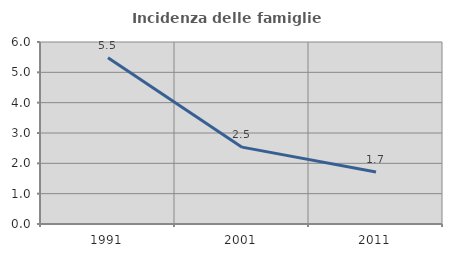
| Category | Incidenza delle famiglie numerose |
|---|---|
| 1991.0 | 5.479 |
| 2001.0 | 2.534 |
| 2011.0 | 1.711 |